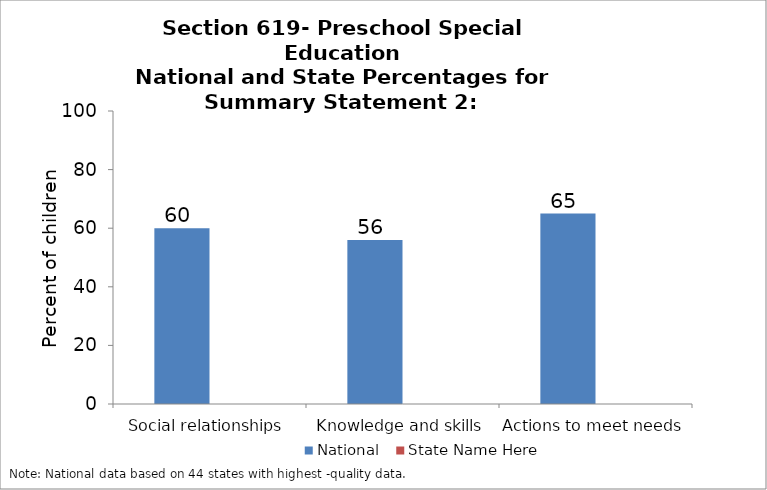
| Category | National | State Name Here |
|---|---|---|
| Social relationships | 60 |  |
| Knowledge and skills | 56 |  |
| Actions to meet needs | 65 |  |